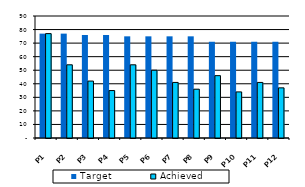
| Category | Target | Achieved  |
|---|---|---|
| P1 | 77 | 77 |
| P2 | 77 | 54 |
| P3 | 76 | 42 |
| P4 | 76 | 35 |
| P5 | 75 | 54 |
| P6 | 75 | 50 |
| P7 | 75 | 41 |
| P8 | 75 | 36 |
| P9 | 71 | 46 |
| P10 | 71 | 34 |
| P11 | 71 | 41 |
| P12 | 71 | 37 |